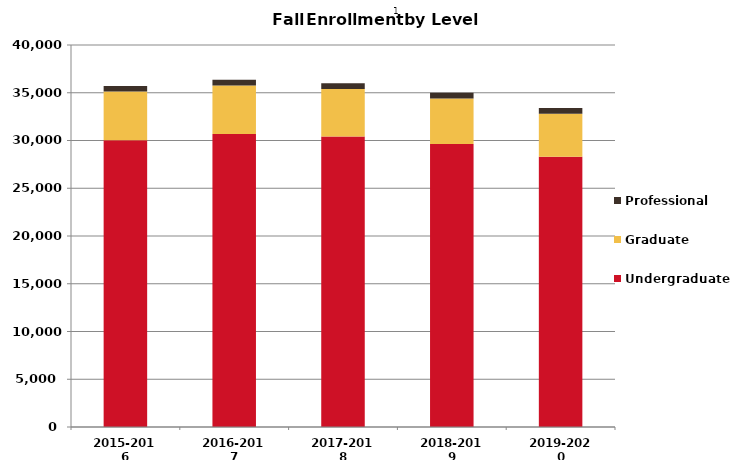
| Category | Undergraduate | Graduate | Professional |
|---|---|---|---|
| 2015-2016 | 30034 | 5096 | 584 |
| 2016-2017 | 30671 | 5096 | 586 |
| 2017-2018 | 30406 | 4991 | 596 |
| 2018-2019 | 29621 | 4774 | 597 |
| 2019-2020 | 28294 | 4498 | 599 |